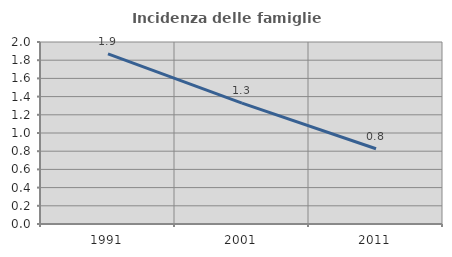
| Category | Incidenza delle famiglie numerose |
|---|---|
| 1991.0 | 1.869 |
| 2001.0 | 1.327 |
| 2011.0 | 0.826 |